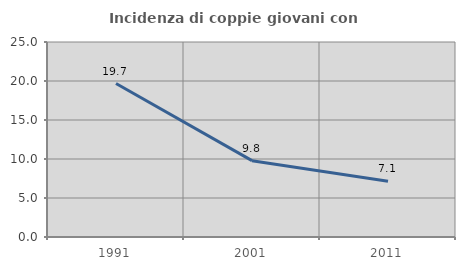
| Category | Incidenza di coppie giovani con figli |
|---|---|
| 1991.0 | 19.679 |
| 2001.0 | 9.786 |
| 2011.0 | 7.143 |